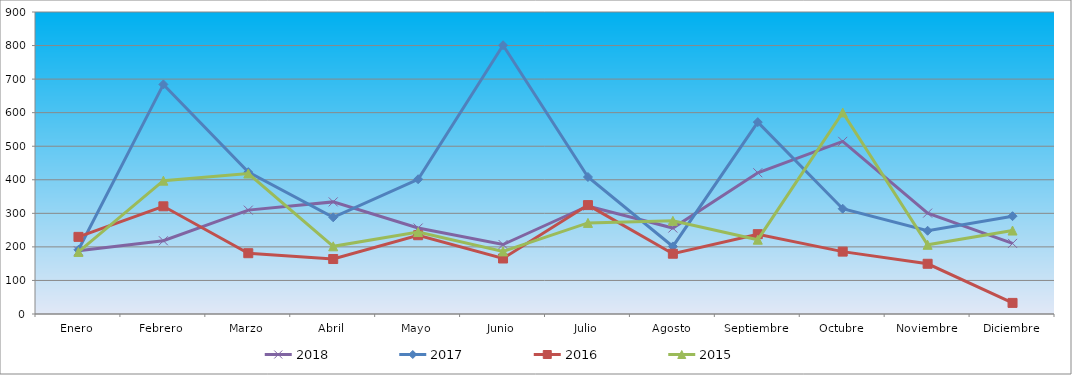
| Category | 2018 | 2017 | 2016 | 2015 |
|---|---|---|---|---|
| Enero | 188.205 | 191.337 | 229.875 | 185.035 |
| Febrero | 218.273 | 684.14 | 320.929 | 397.369 |
| Marzo | 309.591 | 422.72 | 181.183 | 418.603 |
| Abril | 334.091 | 288.117 | 163.852 | 201.718 |
| Mayo | 256.137 | 401.584 | 234.75 | 244.185 |
| Junio | 207.137 | 800.944 | 165.428 | 186.551 |
| Julio | 321.841 | 408.259 | 324.553 | 271.485 |
| Agosto | 256.137 | 201.348 | 179.607 | 277.552 |
| Septiembre | 420.955 | 571.785 | 237.901 | 221.435 |
| Octubre | 514.501 | 313.703 | 185.909 | 600.604 |
| Noviembre | 300.682 | 248.07 | 149.673 | 206.268 |
| Diciembre | 210.478 | 291.455 | 33.086 | 248.735 |